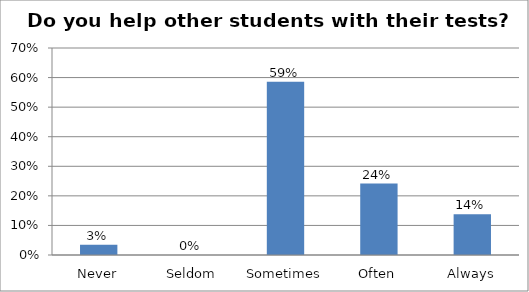
| Category | Series 0 |
|---|---|
| Never | 0.034 |
| Seldom | 0 |
| Sometimes | 0.586 |
| Often | 0.241 |
| Always | 0.138 |